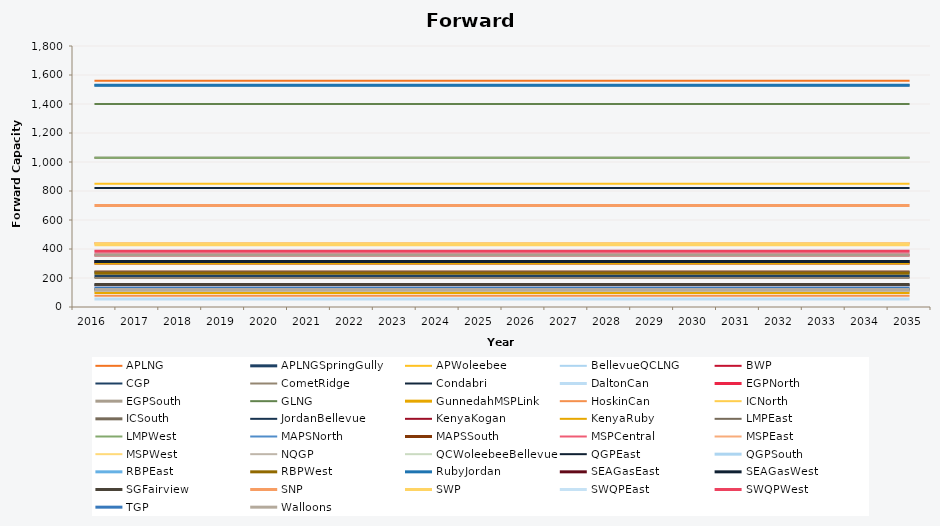
| Category | APLNG | APLNGSpringGully | APWoleebee | BellevueQCLNG | BWP | CGP | CometRidge | Condabri | DaltonCan | EGPNorth | EGPSouth | GLNG | GunnedahMSPLink | HoskinCan | ICNorth | ICSouth | JordanBellevue | KenyaKogan | KenyaRuby | LMPEast | LMPWest | MAPSNorth | MAPSSouth | MSPCentral | MSPEast | MSPWest | NQGP | QCWoleebeeBellevue | QGPEast | QGPSouth | RBPEast | RBPWest | RubyJordan | SEAGasEast | SEAGasWest | SGFairview | SNP | SWP | SWQPEast | SWQPWest | TGP | Walloons |
|---|---|---|---|---|---|---|---|---|---|---|---|---|---|---|---|---|---|---|---|---|---|---|---|---|---|---|---|---|---|---|---|---|---|---|---|---|---|---|---|---|---|---|
| 2016.0 | 1560 | 210 | 850 | 1530 | 150 | 119 | 200 | 820 | 56 | 358 | 358 | 1400 | 100 | 77 | 120 | 120 | 1530 | 300 | 300 | 1030 | 1030 | 241 | 241 | 439 | 439 | 439 | 110 | 1530 | 151 | 151 | 233 | 233 | 1530 | 314 | 314 | 155 | 700 | 429 | 384 | 384 | 130 | 120 |
| 2017.0 | 1560 | 210 | 850 | 1530 | 150 | 119 | 200 | 820 | 56 | 358 | 358 | 1400 | 100 | 77 | 120 | 120 | 1530 | 300 | 300 | 1030 | 1030 | 241 | 241 | 439 | 439 | 439 | 110 | 1530 | 151 | 151 | 233 | 233 | 1530 | 314 | 314 | 155 | 700 | 429 | 384 | 384 | 130 | 120 |
| 2018.0 | 1560 | 210 | 850 | 1530 | 150 | 119 | 200 | 820 | 56 | 358 | 358 | 1400 | 100 | 77 | 120 | 120 | 1530 | 300 | 300 | 1030 | 1030 | 241 | 241 | 439 | 439 | 439 | 110 | 1530 | 151 | 151 | 233 | 233 | 1530 | 314 | 314 | 155 | 700 | 429 | 384 | 384 | 130 | 120 |
| 2019.0 | 1560 | 210 | 850 | 1530 | 150 | 119 | 200 | 820 | 56 | 358 | 358 | 1400 | 100 | 77 | 120 | 120 | 1530 | 300 | 300 | 1030 | 1030 | 241 | 241 | 439 | 439 | 439 | 110 | 1530 | 151 | 151 | 233 | 233 | 1530 | 314 | 314 | 155 | 700 | 429 | 384 | 384 | 130 | 120 |
| 2020.0 | 1560 | 210 | 850 | 1530 | 150 | 119 | 200 | 820 | 56 | 358 | 358 | 1400 | 100 | 77 | 120 | 120 | 1530 | 300 | 300 | 1030 | 1030 | 241 | 241 | 439 | 439 | 439 | 110 | 1530 | 151 | 151 | 233 | 233 | 1530 | 314 | 314 | 155 | 700 | 429 | 384 | 384 | 130 | 120 |
| 2021.0 | 1560 | 210 | 850 | 1530 | 150 | 119 | 200 | 820 | 56 | 358 | 358 | 1400 | 100 | 77 | 120 | 120 | 1530 | 300 | 300 | 1030 | 1030 | 241 | 241 | 439 | 439 | 439 | 110 | 1530 | 151 | 151 | 233 | 233 | 1530 | 314 | 314 | 155 | 700 | 429 | 384 | 384 | 130 | 120 |
| 2022.0 | 1560 | 210 | 850 | 1530 | 150 | 119 | 200 | 820 | 56 | 358 | 358 | 1400 | 100 | 77 | 120 | 120 | 1530 | 300 | 300 | 1030 | 1030 | 241 | 241 | 439 | 439 | 439 | 110 | 1530 | 151 | 151 | 233 | 233 | 1530 | 314 | 314 | 155 | 700 | 429 | 384 | 384 | 130 | 120 |
| 2023.0 | 1560 | 210 | 850 | 1530 | 150 | 119 | 200 | 820 | 56 | 358 | 358 | 1400 | 100 | 77 | 120 | 120 | 1530 | 300 | 300 | 1030 | 1030 | 241 | 241 | 439 | 439 | 439 | 110 | 1530 | 151 | 151 | 233 | 233 | 1530 | 314 | 314 | 155 | 700 | 429 | 384 | 384 | 130 | 120 |
| 2024.0 | 1560 | 210 | 850 | 1530 | 150 | 119 | 200 | 820 | 56 | 358 | 358 | 1400 | 100 | 77 | 120 | 120 | 1530 | 300 | 300 | 1030 | 1030 | 241 | 241 | 439 | 439 | 439 | 110 | 1530 | 151 | 151 | 233 | 233 | 1530 | 314 | 314 | 155 | 700 | 429 | 384 | 384 | 130 | 120 |
| 2025.0 | 1560 | 210 | 850 | 1530 | 150 | 119 | 200 | 820 | 56 | 358 | 358 | 1400 | 100 | 77 | 120 | 120 | 1530 | 300 | 300 | 1030 | 1030 | 241 | 241 | 439 | 439 | 439 | 110 | 1530 | 151 | 151 | 233 | 233 | 1530 | 314 | 314 | 155 | 700 | 429 | 384 | 384 | 130 | 120 |
| 2026.0 | 1560 | 210 | 850 | 1530 | 150 | 119 | 200 | 820 | 56 | 358 | 358 | 1400 | 100 | 77 | 120 | 120 | 1530 | 300 | 300 | 1030 | 1030 | 241 | 241 | 439 | 439 | 439 | 110 | 1530 | 151 | 151 | 233 | 233 | 1530 | 314 | 314 | 155 | 700 | 429 | 384 | 384 | 130 | 120 |
| 2027.0 | 1560 | 210 | 850 | 1530 | 150 | 119 | 200 | 820 | 56 | 358 | 358 | 1400 | 100 | 77 | 120 | 120 | 1530 | 300 | 300 | 1030 | 1030 | 241 | 241 | 439 | 439 | 439 | 110 | 1530 | 151 | 151 | 233 | 233 | 1530 | 314 | 314 | 155 | 700 | 429 | 384 | 384 | 130 | 120 |
| 2028.0 | 1560 | 210 | 850 | 1530 | 150 | 119 | 200 | 820 | 56 | 358 | 358 | 1400 | 100 | 77 | 120 | 120 | 1530 | 300 | 300 | 1030 | 1030 | 241 | 241 | 439 | 439 | 439 | 110 | 1530 | 151 | 151 | 233 | 233 | 1530 | 314 | 314 | 155 | 700 | 429 | 384 | 384 | 130 | 120 |
| 2029.0 | 1560 | 210 | 850 | 1530 | 150 | 119 | 200 | 820 | 56 | 358 | 358 | 1400 | 100 | 77 | 120 | 120 | 1530 | 300 | 300 | 1030 | 1030 | 241 | 241 | 439 | 439 | 439 | 110 | 1530 | 151 | 151 | 233 | 233 | 1530 | 314 | 314 | 155 | 700 | 429 | 384 | 384 | 130 | 120 |
| 2030.0 | 1560 | 210 | 850 | 1530 | 150 | 119 | 200 | 820 | 56 | 358 | 358 | 1400 | 100 | 77 | 120 | 120 | 1530 | 300 | 300 | 1030 | 1030 | 241 | 241 | 439 | 439 | 439 | 110 | 1530 | 151 | 151 | 233 | 233 | 1530 | 314 | 314 | 155 | 700 | 429 | 384 | 384 | 130 | 120 |
| 2031.0 | 1560 | 210 | 850 | 1530 | 150 | 119 | 200 | 820 | 56 | 358 | 358 | 1400 | 100 | 77 | 120 | 120 | 1530 | 300 | 300 | 1030 | 1030 | 241 | 241 | 439 | 439 | 439 | 110 | 1530 | 151 | 151 | 233 | 233 | 1530 | 314 | 314 | 155 | 700 | 429 | 384 | 384 | 130 | 120 |
| 2032.0 | 1560 | 210 | 850 | 1530 | 150 | 119 | 200 | 820 | 56 | 358 | 358 | 1400 | 100 | 77 | 120 | 120 | 1530 | 300 | 300 | 1030 | 1030 | 241 | 241 | 439 | 439 | 439 | 110 | 1530 | 151 | 151 | 233 | 233 | 1530 | 314 | 314 | 155 | 700 | 429 | 384 | 384 | 130 | 120 |
| 2033.0 | 1560 | 210 | 850 | 1530 | 150 | 119 | 200 | 820 | 56 | 358 | 358 | 1400 | 100 | 77 | 120 | 120 | 1530 | 300 | 300 | 1030 | 1030 | 241 | 241 | 439 | 439 | 439 | 110 | 1530 | 151 | 151 | 233 | 233 | 1530 | 314 | 314 | 155 | 700 | 429 | 384 | 384 | 130 | 120 |
| 2034.0 | 1560 | 210 | 850 | 1530 | 150 | 119 | 200 | 820 | 56 | 358 | 358 | 1400 | 100 | 77 | 120 | 120 | 1530 | 300 | 300 | 1030 | 1030 | 241 | 241 | 439 | 439 | 439 | 110 | 1530 | 151 | 151 | 233 | 233 | 1530 | 314 | 314 | 155 | 700 | 429 | 384 | 384 | 130 | 120 |
| 2035.0 | 1560 | 210 | 850 | 1530 | 150 | 119 | 200 | 820 | 56 | 358 | 358 | 1400 | 100 | 77 | 120 | 120 | 1530 | 300 | 300 | 1030 | 1030 | 241 | 241 | 439 | 439 | 439 | 110 | 1530 | 151 | 151 | 233 | 233 | 1530 | 314 | 314 | 155 | 700 | 429 | 384 | 384 | 130 | 120 |